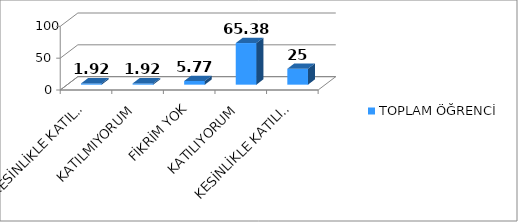
| Category | TOPLAM ÖĞRENCİ |
|---|---|
| KESİNLİKLE KATILMIYORUM | 1.92 |
| KATILMIYORUM | 1.92 |
| FİKRİM YOK | 5.77 |
| KATILIYORUM | 65.38 |
| KESİNLİKLE KATILIYORUM | 25 |